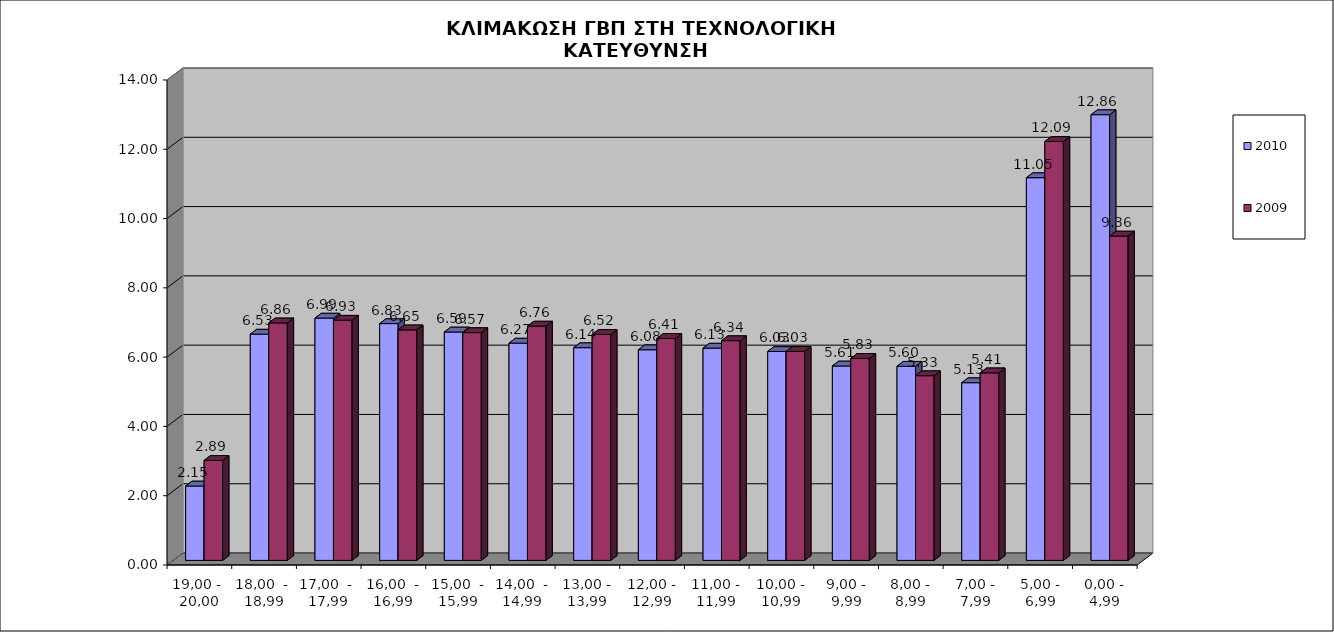
| Category | 2010 | 2009 |
|---|---|---|
| 19,00 -  20,00 | 2.147 | 2.886 |
| 18,00  -  18,99 | 6.531 | 6.855 |
| 17,00  -  17,99 | 6.994 | 6.933 |
| 16,00  - 16,99 | 6.834 | 6.654 |
| 15,00  - 15,99 | 6.593 | 6.574 |
| 14,00  - 14,99 | 6.271 | 6.763 |
| 13,00 - 13,99 | 6.139 | 6.523 |
| 12,00 - 12,99 | 6.08 | 6.407 |
| 11,00 - 11,99 | 6.127 | 6.342 |
| 10,00 - 10,99 | 6.03 | 6.033 |
| 9,00 - 9,99 | 5.611 | 5.832 |
| 8,00 - 8,99 | 5.604 | 5.331 |
| 7,00 - 7,99 | 5.128 | 5.414 |
| 5,00 - 6,99 | 11.046 | 12.091 |
| 0,00 - 4,99 | 12.864 | 9.362 |